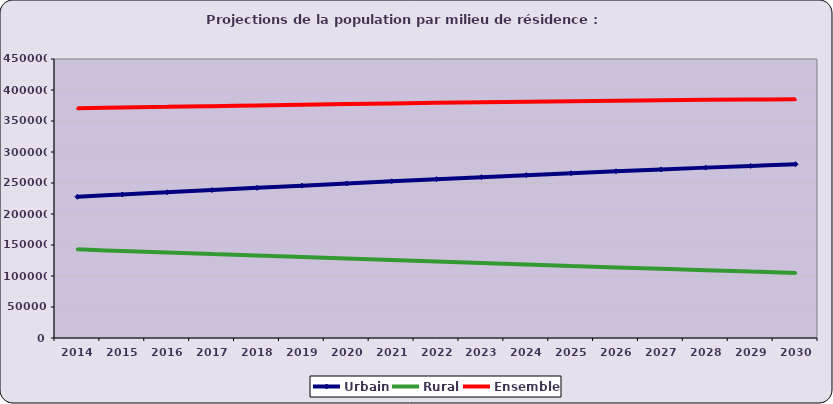
| Category | Urbain | Rural | Ensemble |
|---|---|---|---|
| 2014.0 | 227818 | 142946 | 370764 |
| 2015.0 | 231417 | 140367 | 371784 |
| 2016.0 | 235023 | 137841 | 372864 |
| 2017.0 | 238624 | 135355 | 373979 |
| 2018.0 | 242208 | 132899 | 375107 |
| 2019.0 | 245760 | 130465 | 376225 |
| 2020.0 | 249269 | 128045 | 377314 |
| 2021.0 | 252721 | 125640 | 378361 |
| 2022.0 | 256105 | 123250 | 379355 |
| 2023.0 | 259418 | 120875 | 380293 |
| 2024.0 | 262657 | 118519 | 381176 |
| 2025.0 | 265820 | 116186 | 382006 |
| 2026.0 | 268904 | 113877 | 382781 |
| 2027.0 | 271901 | 111591 | 383492 |
| 2028.0 | 274800 | 109329 | 384129 |
| 2029.0 | 277591 | 107091 | 384682 |
| 2030.0 | 280263 | 104878 | 385141 |